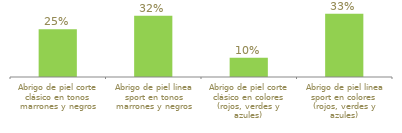
| Category | Series 0 |
|---|---|
| Abrigo de piel corte clásico en tonos marrones y negros | 0.25 |
| Abrigo de piel línea sport en tonos marrones y negros | 0.32 |
| Abrigo de piel corte clásico en colores (rojos, verdes y azules) | 0.1 |
| Abrigo de piel línea sport en colores  (rojos, verdes y azules) | 0.33 |